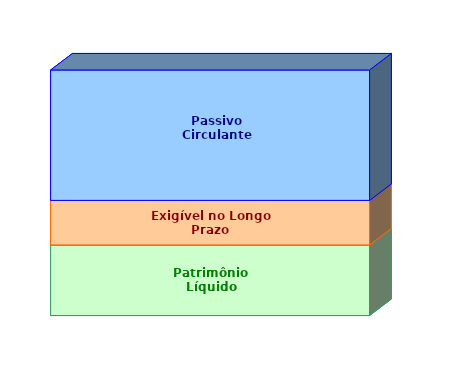
| Category | Patrimônio Líquido | Exigível no Longo Prazo | Passivo Circulante |
|---|---|---|---|
| 0 | 0.287 | 0.181 | 0.531 |